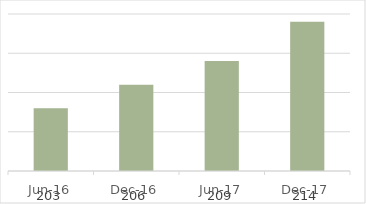
| Category | Series 0 |
|---|---|
| 2016-06-01 | 203 |
| 2016-12-01 | 206 |
| 2017-06-01 | 209 |
| 2017-12-01 | 214 |